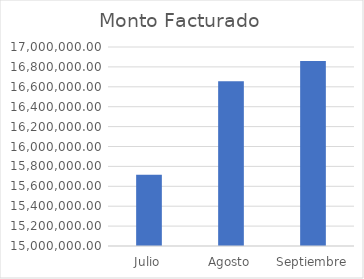
| Category | Monto Facturado |
|---|---|
| Julio | 15715213 |
| Agosto | 16655831 |
| Septiembre | 16859005 |